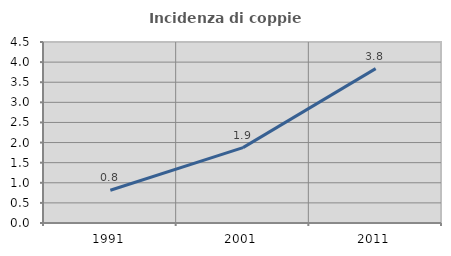
| Category | Incidenza di coppie miste |
|---|---|
| 1991.0 | 0.815 |
| 2001.0 | 1.874 |
| 2011.0 | 3.838 |